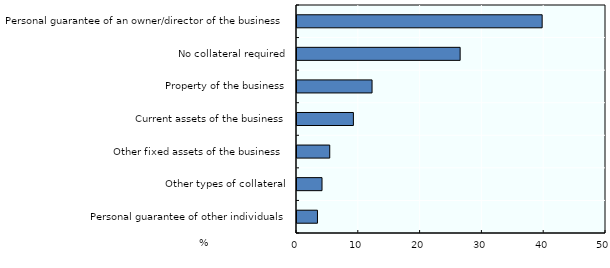
| Category | Series 0 |
|---|---|
| Personal guarantee of other individuals | 3.312 |
| Other types of collateral | 4.048 |
| Other fixed assets of the business  | 5.299 |
| Current assets of the business | 9.126 |
| Property of the business | 12.144 |
| No collateral required | 26.4 |
| Personal guarantee of an owner/director of the business | 39.67 |